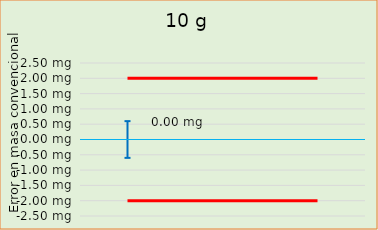
| Category | Error en masa convencional  |  ± EMP |
|---|---|---|
| 0 |  | -2 |
| 1 |  | -2 |
| 2 |  | -2 |